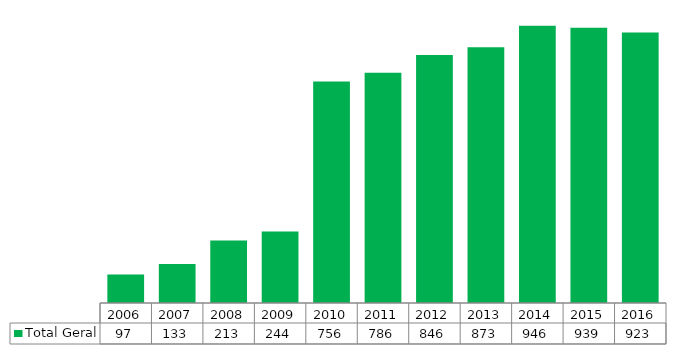
| Category | Total Geral |
|---|---|
| 2006.0 | 97 |
| 2007.0 | 133 |
| 2008.0 | 213 |
| 2009.0 | 244 |
| 2010.0 | 756 |
| 2011.0 | 786 |
| 2012.0 | 846 |
| 2013.0 | 873 |
| 2014.0 | 946 |
| 2015.0 | 939 |
| 2016.0 | 923 |